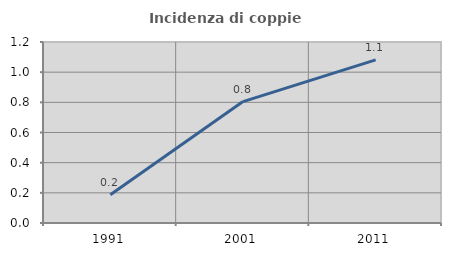
| Category | Incidenza di coppie miste |
|---|---|
| 1991.0 | 0.187 |
| 2001.0 | 0.805 |
| 2011.0 | 1.081 |